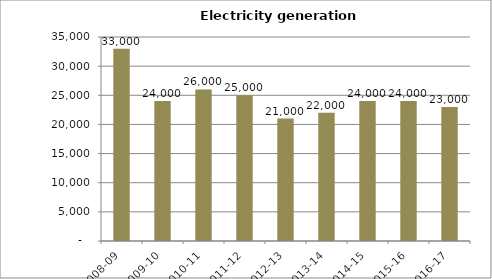
| Category | Electricity generation (tonnes) |
|---|---|
| 2008-09 | 33000 |
| 2009-10 | 24000 |
| 2010-11 | 26000 |
| 2011-12 | 25000 |
| 2012-13 | 21000 |
| 2013-14 | 22000 |
| 2014-15 | 24000 |
| 2015-16 | 24000 |
| 2016-17 | 23000 |